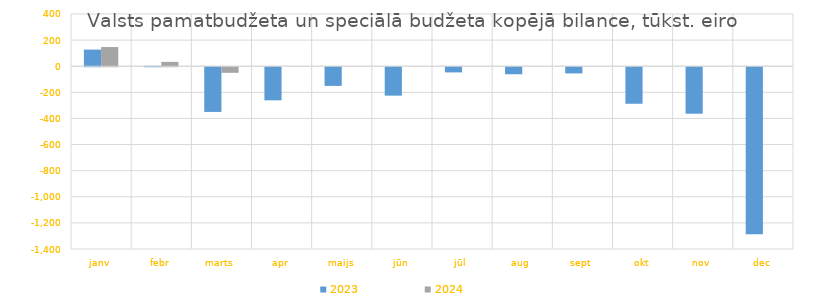
| Category | 2023 | 2024 |
|---|---|---|
| janv | 127204.091 | 146817.044 |
| febr | 2640.716 | 33202.188 |
| marts | -342545.514 | -42828.848 |
| apr | -253652.641 | 0 |
| maijs | -143054.463 | 0 |
| jūn | -217730.866 | 0 |
| jūl | -39678.691 | 0 |
| aug | -53894.673 | 0 |
| sept | -47453.058 | 0 |
| okt | -279789.541 | 0 |
| nov | -356015.19 | 0 |
| dec | -1279587.92 | 0 |